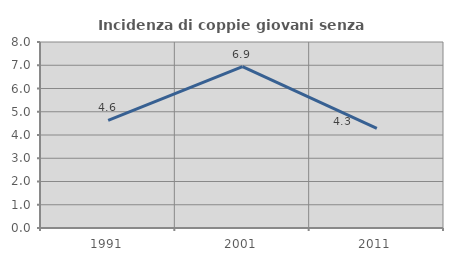
| Category | Incidenza di coppie giovani senza figli |
|---|---|
| 1991.0 | 4.628 |
| 2001.0 | 6.936 |
| 2011.0 | 4.286 |